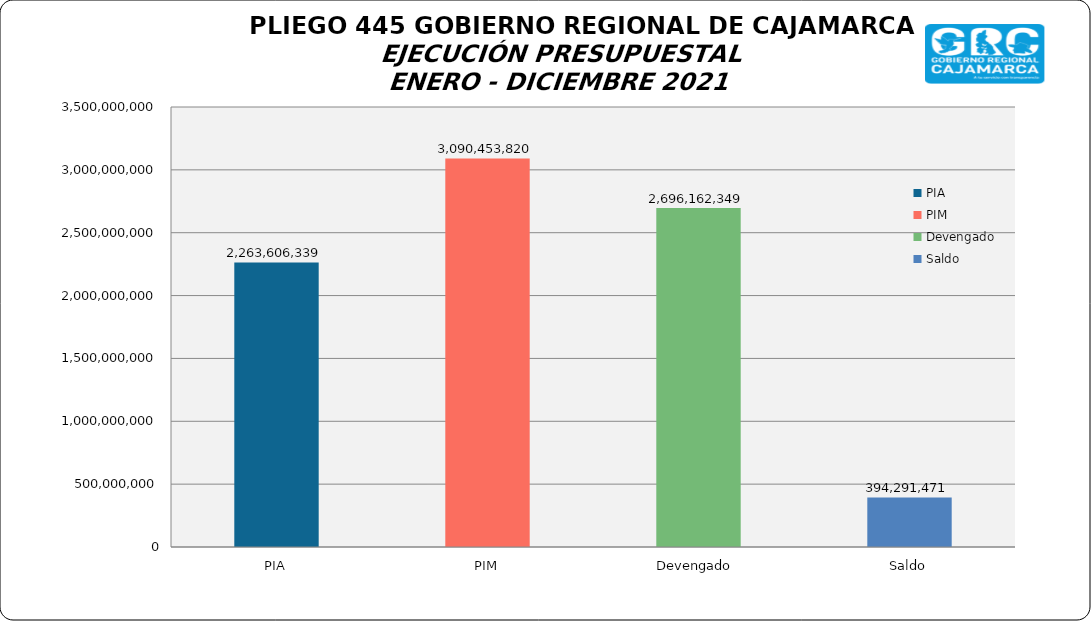
| Category | Series 0 |
|---|---|
| PIA | 2263606339 |
| PIM | 3090453820 |
| Devengado  | 2696162349 |
| Saldo | 394291471 |